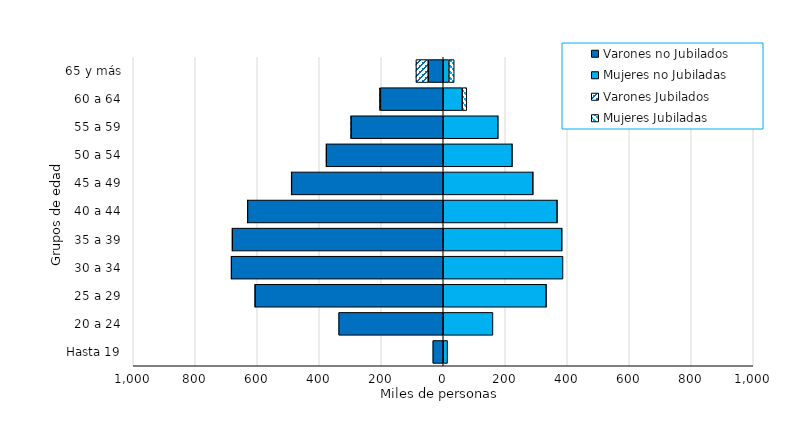
| Category | Varones no Jubilados | Mujeres no Jubiladas | Varones Jubilados | Mujeres Jubiladas |
|---|---|---|---|---|
| Hasta 19 | -33670 | 13938 | 0 | 0 |
| 20 a 24 | -337423 | 160368 | 0 | 0 |
| 25 a 29 | -607424 | 332291 | -2 | 1 |
| 30 a 34 | -683885 | 386381 | -3 | 0 |
| 35 a 39 | -680824 | 382827 | -14 | 6 |
| 40 a 44 | -631414 | 367564 | -57 | 11 |
| 45 a 49 | -489638 | 289563 | -167 | 46 |
| 50 a 54 | -377456 | 222353 | -355 | 93 |
| 55 a 59 | -297438 | 176446 | -1170 | 547 |
| 60 a 64 | -202682 | 61106 | -2877 | 14893 |
| 65 y más | -48540 | 18220 | -39691 | 17153 |